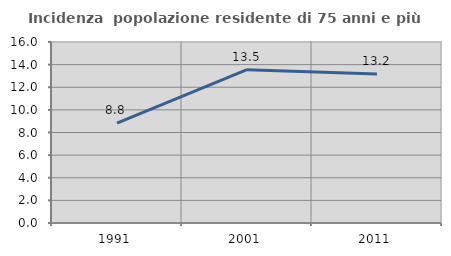
| Category | Incidenza  popolazione residente di 75 anni e più |
|---|---|
| 1991.0 | 8.833 |
| 2001.0 | 13.55 |
| 2011.0 | 13.175 |